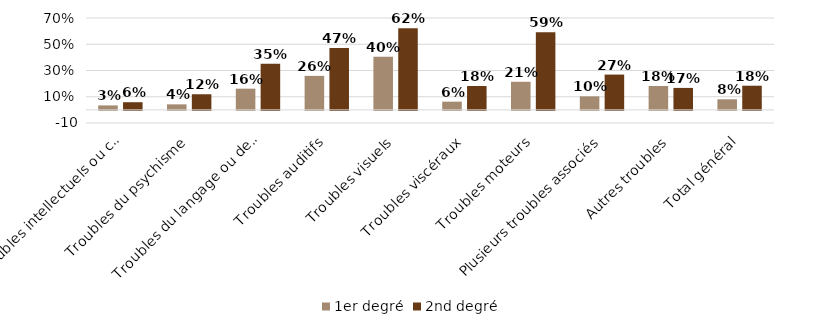
| Category | 1er degré | 2nd degré |
|---|---|---|
| Troubles intellectuels ou cognitifs | 0.034 | 0.058 |
| Troubles du psychisme | 0.042 | 0.119 |
| Troubles du langage ou de la parole | 0.162 | 0.352 |
| Troubles auditifs | 0.259 | 0.471 |
| Troubles visuels | 0.404 | 0.622 |
| Troubles viscéraux | 0.062 | 0.182 |
| Troubles moteurs | 0.214 | 0.592 |
| Plusieurs troubles associés | 0.103 | 0.269 |
| Autres troubles | 0.182 | 0.167 |
| Total général | 0.081 | 0.184 |